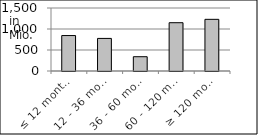
| Category | volume |
|---|---|
| ≤ 12 months | 844071842.17 |
| 12 - 36 months | 775949325.77 |
| 36 - 60 months | 340132055.7 |
| 60 - 120 months | 1149784497.17 |
| ≥ 120 months | 1229915444.482 |